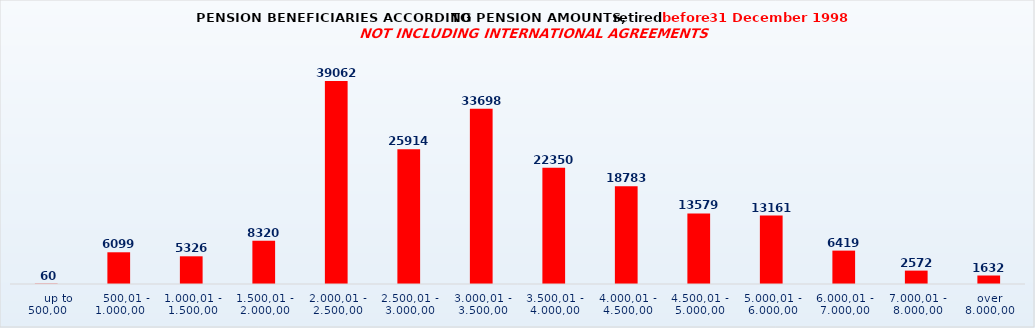
| Category | Series 0 |
|---|---|
|      up to 500,00 | 60 |
|    500,01 - 1.000,00 | 6099 |
| 1.000,01 - 1.500,00 | 5326 |
| 1.500,01 - 2.000,00 | 8320 |
| 2.000,01 - 2.500,00 | 39062 |
| 2.500,01 - 3.000,00 | 25914 |
| 3.000,01 - 3.500,00 | 33698 |
| 3.500,01 - 4.000,00 | 22350 |
| 4.000,01 - 4.500,00 | 18783 |
| 4.500,01 - 5.000,00 | 13579 |
| 5.000,01 - 6.000,00 | 13161 |
| 6.000,01 - 7.000,00 | 6419 |
| 7.000,01 - 8.000,00 | 2572 |
| over 8.000,00 | 1632 |